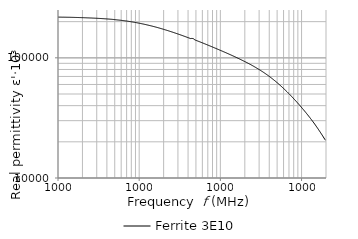
| Category | Ferrite 3E10 |
|---|---|
| 10000.0 | 218692.149 |
| 10192.3 | 218054.43 |
| 10388.3 | 218080.157 |
| 10588.1 | 218044.799 |
| 10791.8 | 218003.172 |
| 10999.3 | 217926.461 |
| 11210.9 | 217883.08 |
| 11426.5 | 217834.702 |
| 11646.2 | 217842.233 |
| 11870.2 | 217821.433 |
| 12098.5 | 217763.692 |
| 12331.2 | 217726.11 |
| 12568.4 | 217623.988 |
| 12810.1 | 217577.782 |
| 13056.5 | 217556.927 |
| 13307.6 | 217512.605 |
| 13563.5 | 217493.123 |
| 13824.4 | 217452.286 |
| 14090.2 | 217369.493 |
| 14361.2 | 217330.528 |
| 14637.4 | 217234.562 |
| 14919.0 | 217158.293 |
| 15205.9 | 217086.795 |
| 15498.3 | 216997.597 |
| 15796.4 | 216926.382 |
| 16100.2 | 216860.296 |
| 16409.9 | 216780.591 |
| 16725.5 | 216684.007 |
| 17047.1 | 216648.392 |
| 17375.0 | 216555.298 |
| 17709.2 | 216435.138 |
| 18049.7 | 216362.526 |
| 18396.9 | 216267.536 |
| 18750.7 | 216193.649 |
| 19111.3 | 216085.809 |
| 19478.9 | 215991.702 |
| 19853.5 | 215883.708 |
| 20235.3 | 215812.118 |
| 20624.5 | 215708.353 |
| 21021.2 | 215603.313 |
| 21425.5 | 215459.026 |
| 21837.5 | 215377.379 |
| 22257.5 | 215271.31 |
| 22685.6 | 215163.72 |
| 23121.9 | 215048.535 |
| 23566.6 | 214947.765 |
| 24019.8 | 214827.256 |
| 24481.8 | 214716.428 |
| 24952.6 | 214596.162 |
| 25432.5 | 214470.513 |
| 25921.7 | 214355.198 |
| 26420.2 | 214194.19 |
| 26928.3 | 214067.816 |
| 27446.2 | 213930.227 |
| 27974.1 | 213791.945 |
| 28512.1 | 213682.244 |
| 29060.5 | 213524.727 |
| 29619.4 | 213399.792 |
| 30189.0 | 213284.801 |
| 30769.6 | 213119.267 |
| 31361.4 | 212963.883 |
| 31964.6 | 212808.76 |
| 32579.3 | 212641.602 |
| 33205.9 | 212501.188 |
| 33844.5 | 212299.599 |
| 34495.4 | 212127.705 |
| 35158.9 | 211937.346 |
| 35835.1 | 211759.024 |
| 36524.3 | 211602.919 |
| 37226.7 | 211410.794 |
| 37942.7 | 211227.108 |
| 38672.4 | 211042.524 |
| 39416.2 | 210853.055 |
| 40174.3 | 210653.342 |
| 40946.9 | 210431.741 |
| 41734.4 | 210244.238 |
| 42537.1 | 210035.716 |
| 43355.2 | 209807.544 |
| 44189.0 | 209568.013 |
| 45038.9 | 209388.355 |
| 45905.1 | 209175.74 |
| 46787.9 | 208911.522 |
| 47687.8 | 208651.619 |
| 48604.9 | 208396.482 |
| 49539.7 | 208119.36 |
| 50492.5 | 207665.077 |
| 51463.6 | 207417.376 |
| 52453.4 | 207135.336 |
| 53462.2 | 206822.567 |
| 54490.4 | 206524.412 |
| 55538.4 | 206232.463 |
| 56606.5 | 205980.74 |
| 57695.2 | 205714.354 |
| 58804.8 | 205438.717 |
| 59935.8 | 205173.527 |
| 61088.5 | 204803.361 |
| 62263.4 | 204495.448 |
| 63460.9 | 204134.652 |
| 64681.4 | 203773.523 |
| 65925.4 | 203429.022 |
| 67193.3 | 203053.838 |
| 68485.6 | 202715.11 |
| 69802.7 | 202344.151 |
| 71145.2 | 201968.826 |
| 72513.5 | 201592.444 |
| 73908.1 | 201221.523 |
| 75329.5 | 200820.204 |
| 76778.3 | 200430.136 |
| 78255.0 | 200004.235 |
| 79760.0 | 199580.067 |
| 81294.0 | 199171.454 |
| 82857.5 | 198737.016 |
| 84451.0 | 198300.216 |
| 86075.2 | 197866.411 |
| 87730.7 | 197426.718 |
| 89417.9 | 196971.837 |
| 91137.7 | 196466.515 |
| 92890.5 | 196009.264 |
| 94677.0 | 195541.371 |
| 96497.9 | 195046.858 |
| 98353.8 | 194557.23 |
| 100245.0 | 194066.674 |
| 102173.0 | 193575.593 |
| 104138.0 | 193080.213 |
| 106141.0 | 192558.791 |
| 108183.0 | 192039.453 |
| 110263.0 | 191520.639 |
| 112384.0 | 190990.421 |
| 114545.0 | 190460.05 |
| 116748.0 | 189905.67 |
| 118994.0 | 189365.665 |
| 121282.0 | 188815.344 |
| 123615.0 | 188251.274 |
| 125992.0 | 187677.4 |
| 128415.0 | 187104.767 |
| 130885.0 | 186534.58 |
| 133402.0 | 185965.25 |
| 135968.0 | 185402.666 |
| 138583.0 | 184814.374 |
| 141248.0 | 184221.511 |
| 143965.0 | 183636.696 |
| 146734.0 | 183047.01 |
| 149556.0 | 182419.088 |
| 152432.0 | 181810.331 |
| 155364.0 | 181208.26 |
| 158352.0 | 180589.745 |
| 161397.0 | 179964.581 |
| 164501.0 | 179324.933 |
| 167665.0 | 178693.313 |
| 170890.0 | 178053.642 |
| 174176.0 | 177417.28 |
| 177526.0 | 176777.848 |
| 180940.0 | 176117.994 |
| 184420.0 | 175433.17 |
| 187967.0 | 174781.5 |
| 191582.0 | 174130.117 |
| 195267.0 | 173459.637 |
| 199022.0 | 172791.134 |
| 202850.0 | 172107.763 |
| 206751.0 | 171435.63 |
| 210728.0 | 170765.867 |
| 214780.0 | 170099.845 |
| 218911.0 | 169414.885 |
| 223121.0 | 168738.599 |
| 227413.0 | 168051.493 |
| 231786.0 | 167363.315 |
| 236244.0 | 166671.431 |
| 240788.0 | 165985.207 |
| 245419.0 | 165299.345 |
| 250139.0 | 164615.968 |
| 254949.0 | 163914.556 |
| 259853.0 | 163220.204 |
| 264850.0 | 162517.812 |
| 269944.0 | 161814.286 |
| 275136.0 | 161106.359 |
| 280427.0 | 160394.933 |
| 285821.0 | 159684.949 |
| 291318.0 | 158983.203 |
| 296920.0 | 158292.6 |
| 302631.0 | 157585.763 |
| 308451.0 | 156886.143 |
| 314383.0 | 156174.244 |
| 320430.0 | 155466.312 |
| 326593.0 | 154751.897 |
| 332874.0 | 154048.907 |
| 339276.0 | 153334.243 |
| 345801.0 | 152615.168 |
| 352451.0 | 151899.215 |
| 359230.0 | 151197.88 |
| 366139.0 | 150498.314 |
| 373181.0 | 149794.062 |
| 380358.0 | 149079.567 |
| 387673.0 | 148272.875 |
| 395129.0 | 147675.417 |
| 402728.0 | 146972.555 |
| 410474.0 | 146249.687 |
| 418368.0 | 145544.088 |
| 426414.0 | 144836.156 |
| 434615.0 | 144128.608 |
| 442974.0 | 145097.716 |
| 451494.0 | 144962.198 |
| 460177.0 | 144533.492 |
| 469027.0 | 143978.944 |
| 478048.0 | 141887.473 |
| 487242.0 | 140793.195 |
| 496613.0 | 140082.845 |
| 506164.0 | 139386.376 |
| 515899.0 | 138684.318 |
| 525821.0 | 137990.239 |
| 535934.0 | 137299.559 |
| 546241.0 | 136620.351 |
| 556746.0 | 135911.045 |
| 567454.0 | 135217.117 |
| 578368.0 | 134553.404 |
| 589491.0 | 133847.71 |
| 600828.0 | 133148.13 |
| 612384.0 | 132462.267 |
| 624162.0 | 131786.589 |
| 636166.0 | 131108.335 |
| 648401.0 | 130419.732 |
| 660871.0 | 129737.696 |
| 673581.0 | 129056.932 |
| 686536.0 | 128384.143 |
| 699740.0 | 127704.353 |
| 713198.0 | 127032.971 |
| 726914.0 | 126358.023 |
| 740894.0 | 125692.73 |
| 755144.0 | 125030.991 |
| 769667.0 | 124371.393 |
| 784470.0 | 123718.3 |
| 799557.0 | 123051.684 |
| 814934.0 | 122381.859 |
| 830608.0 | 121724.043 |
| 846582.0 | 121065.837 |
| 862864.0 | 120411.764 |
| 879459.0 | 119751.927 |
| 896373.0 | 119097.561 |
| 913613.0 | 118442.284 |
| 931184.0 | 117795.78 |
| 949093.0 | 117149.566 |
| 967346.0 | 116509.824 |
| 985951.0 | 115875.087 |
| 1004910.0 | 115276.241 |
| 1024240.0 | 114643.557 |
| 1043940.0 | 114004.409 |
| 1064020.0 | 113363.016 |
| 1084480.0 | 112733.841 |
| 1105340.0 | 112111.35 |
| 1126600.0 | 111476.103 |
| 1148260.0 | 110846.8 |
| 1170350.0 | 110233.594 |
| 1192860.0 | 109622.104 |
| 1215800.0 | 109002.038 |
| 1239180.0 | 108373.313 |
| 1263010.0 | 107762.939 |
| 1287300.0 | 107147.107 |
| 1312060.0 | 106534.951 |
| 1337300.0 | 105914.626 |
| 1363010.0 | 105282.981 |
| 1389230.0 | 104673.832 |
| 1415950.0 | 104072.786 |
| 1443180.0 | 103457.43 |
| 1470940.0 | 102852.057 |
| 1499230.0 | 102240.28 |
| 1528060.0 | 101628.71 |
| 1557450.0 | 101017.558 |
| 1587400.0 | 100405.717 |
| 1617930.0 | 99802.806 |
| 1649050.0 | 99198.377 |
| 1680760.0 | 98593.967 |
| 1713090.0 | 97983.678 |
| 1746040.0 | 97377.917 |
| 1779620.0 | 96753.39 |
| 1813840.0 | 96144.548 |
| 1848730.0 | 95543.663 |
| 1884280.0 | 94936.872 |
| 1920520.0 | 94325.086 |
| 1957460.0 | 93717.863 |
| 1995110.0 | 93122.688 |
| 2033480.0 | 92532.986 |
| 2072580.0 | 91967.164 |
| 2112450.0 | 91366.885 |
| 2153070.0 | 90764.23 |
| 2194480.0 | 90146.426 |
| 2236690.0 | 89532.974 |
| 2279700.0 | 88917.656 |
| 2323550.0 | 88302.643 |
| 2368240.0 | 87697.846 |
| 2413780.0 | 87076.815 |
| 2460210.0 | 86453.635 |
| 2507520.0 | 85827.789 |
| 2555750.0 | 85205.182 |
| 2604900.0 | 84578.391 |
| 2655000.0 | 83948.902 |
| 2706060.0 | 83327.869 |
| 2758110.0 | 82696.163 |
| 2811150.0 | 82060.902 |
| 2865220.0 | 81428.031 |
| 2920320.0 | 80794.328 |
| 2976490.0 | 80189.848 |
| 3033730.0 | 79548.923 |
| 3092080.0 | 78907.839 |
| 3151550.0 | 78264.421 |
| 3212160.0 | 77618.134 |
| 3273940.0 | 76972.042 |
| 3336900.0 | 76322.06 |
| 3401080.0 | 75671.823 |
| 3466490.0 | 75021.419 |
| 3533160.0 | 74369.74 |
| 3601110.0 | 73719.036 |
| 3670370.0 | 73080.928 |
| 3740960.0 | 72420.151 |
| 3812910.0 | 71748.168 |
| 3886240.0 | 71084.655 |
| 3960980.0 | 70404.013 |
| 4037160.0 | 69737.299 |
| 4114810.0 | 69064.927 |
| 4193950.0 | 68392.501 |
| 4274610.0 | 67715.435 |
| 4356820.0 | 67040.848 |
| 4440610.0 | 66360.21 |
| 4526010.0 | 65680.802 |
| 4613060.0 | 65005.383 |
| 4701780.0 | 64332.416 |
| 4792210.0 | 63647.047 |
| 4884370.0 | 62957.733 |
| 4978310.0 | 62278.842 |
| 5074060.0 | 61606.361 |
| 5171640.0 | 60930.586 |
| 5271110.0 | 60246.772 |
| 5372480.0 | 59568.492 |
| 5475810.0 | 58892.742 |
| 5581120.0 | 58212.754 |
| 5688460.0 | 57530.176 |
| 5797870.0 | 56845.475 |
| 5909370.0 | 56167.659 |
| 6023030.0 | 55492.988 |
| 6138860.0 | 54821.241 |
| 6256930.0 | 54148.618 |
| 6377270.0 | 53475.627 |
| 6499920.0 | 52809.001 |
| 6624930.0 | 52148.897 |
| 6752340.0 | 51484.57 |
| 6882200.0 | 50829.541 |
| 7014570.0 | 50180.615 |
| 7149470.0 | 49524.179 |
| 7286980.0 | 48870.966 |
| 7427120.0 | 48222.465 |
| 7569960.0 | 47571.218 |
| 7715550.0 | 46932.519 |
| 7863940.0 | 46292.959 |
| 8015190.0 | 45660.619 |
| 8169340.0 | 45037.053 |
| 8326450.0 | 44414.689 |
| 8486590.0 | 43792.78 |
| 8649810.0 | 43180.589 |
| 8816170.0 | 42573.414 |
| 8985730.0 | 41965.377 |
| 9158540.0 | 41365.627 |
| 9334690.0 | 40762.032 |
| 9514210.0 | 40165.119 |
| 9697200.0 | 39572.045 |
| 9883700.0 | 38980.703 |
| 10073800.0 | 38401.896 |
| 10267500.0 | 37826.181 |
| 10465000.0 | 37253.008 |
| 10666300.0 | 36685.42 |
| 10871400.0 | 36118.022 |
| 11080500.0 | 35563.006 |
| 11293600.0 | 35009.825 |
| 11510800.0 | 34456.985 |
| 11732200.0 | 33909.904 |
| 11957800.0 | 33369.757 |
| 12187800.0 | 32831.787 |
| 12422200.0 | 32297.992 |
| 12661100.0 | 31771.046 |
| 12904600.0 | 31244.923 |
| 13152800.0 | 30726.99 |
| 13405800.0 | 30210.05 |
| 13663600.0 | 29699.21 |
| 13926400.0 | 29189.513 |
| 14194200.0 | 28686.073 |
| 14467200.0 | 28185.355 |
| 14745400.0 | 27686.436 |
| 15029000.0 | 27167.366 |
| 15318100.0 | 26673.267 |
| 15612700.0 | 26182.795 |
| 15913000.0 | 25693.088 |
| 16219000.0 | 25212.403 |
| 16530900.0 | 24735.873 |
| 16848900.0 | 24264.049 |
| 17172900.0 | 23794.994 |
| 17503200.0 | 23330.989 |
| 17839800.0 | 22869.859 |
| 18182900.0 | 22416.207 |
| 18532600.0 | 21966.569 |
| 18889100.0 | 21519.078 |
| 19252300.0 | 21073.485 |
| 19622600.0 | 20629.301 |